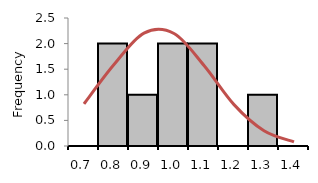
| Category | Freq |
|---|---|
| 0.7 | 0 |
| 0.8 | 2 |
| 0.9 | 1 |
| 1.0 | 2 |
| 1.1 | 2 |
| 1.2 | 0 |
| 1.3 | 1 |
| 1.4 | 0 |